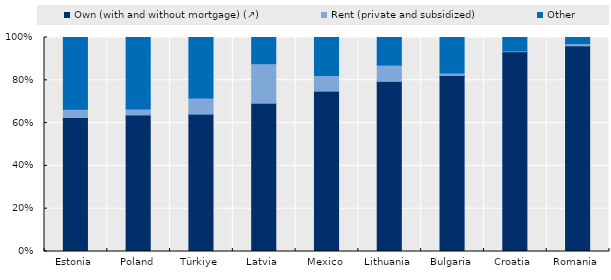
| Category | Own (with and without mortgage) (↗) | Rent (private and subsidized) | Other |
|---|---|---|---|
| Estonia | 0.626 | 0.039 | 0.335 |
| Poland | 0.638 | 0.028 | 0.334 |
| Türkiye | 0.642 | 0.076 | 0.282 |
| Latvia | 0.693 | 0.185 | 0.122 |
| Mexico | 0.749 | 0.073 | 0.177 |
| Lithuania | 0.795 | 0.076 | 0.129 |
| Bulgaria | 0.823 | 0.011 | 0.166 |
| Croatia | 0.934 | 0.004 | 0.063 |
| Romania | 0.961 | 0.011 | 0.028 |